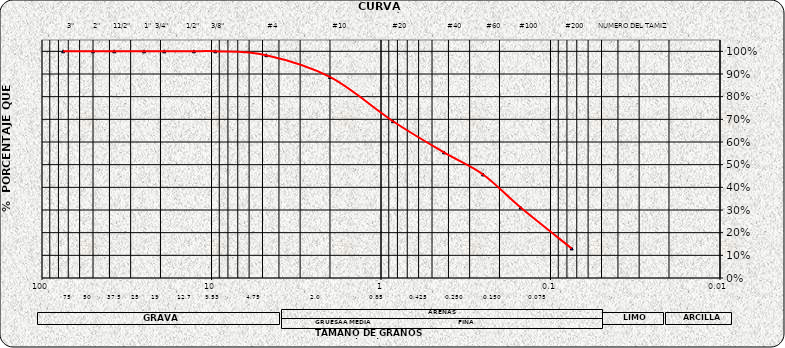
| Category | Series 0 |
|---|---|
| 75.0 | 1 |
| 50.0 | 1 |
| 37.5 | 1 |
| 25.0 | 1 |
| 19.0 | 1 |
| 12.7 | 1 |
| 9.5 | 1 |
| 4.75 | 0.983 |
| 2.0 | 0.887 |
| 0.85 | 0.692 |
| 0.425 | 0.554 |
| 0.25 | 0.457 |
| 0.15 | 0.311 |
| 0.075 | 0.13 |
| nan | 0 |